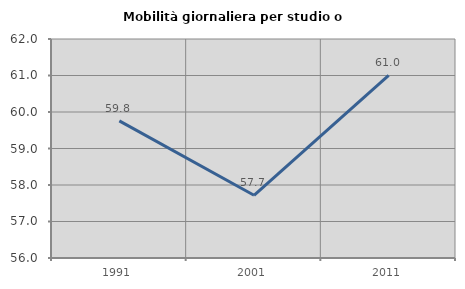
| Category | Mobilità giornaliera per studio o lavoro |
|---|---|
| 1991.0 | 59.756 |
| 2001.0 | 57.718 |
| 2011.0 | 61.006 |